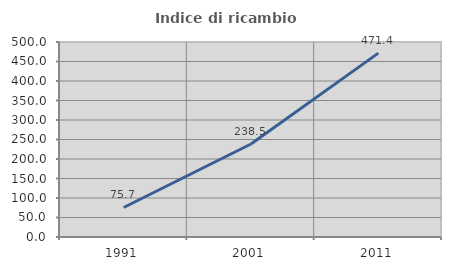
| Category | Indice di ricambio occupazionale  |
|---|---|
| 1991.0 | 75.676 |
| 2001.0 | 238.462 |
| 2011.0 | 471.429 |